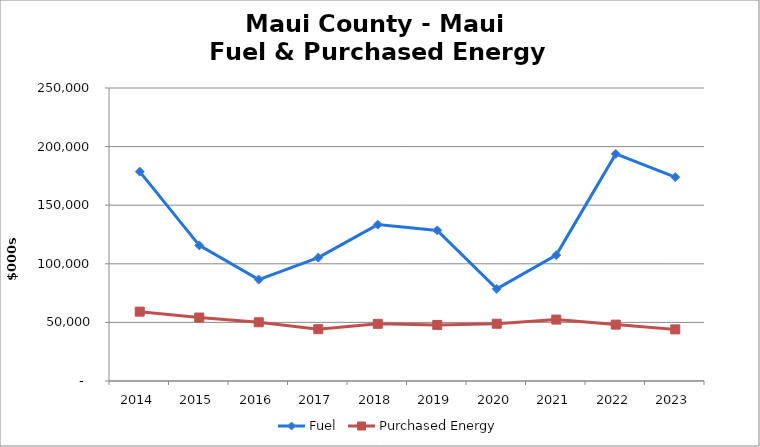
| Category | Fuel | Purchased Energy |
|---|---|---|
| 2014.0 | 178664.9 | 59173.7 |
| 2015.0 | 115740.2 | 54162.4 |
| 2016.0 | 86545 | 50079 |
| 2017.0 | 105225.9 | 44232.1 |
| 2018.0 | 133449.7 | 48776.4 |
| 2019.0 | 128512 | 47826.6 |
| 2020.0 | 78593.7 | 48867.6 |
| 2021.0 | 107420.598 | 52412.972 |
| 2022.0 | 193743.835 | 48108.302 |
| 2023.0 | 173999.731 | 44039.405 |